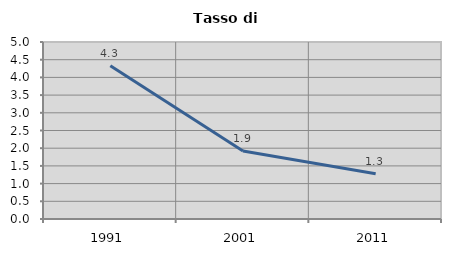
| Category | Tasso di disoccupazione   |
|---|---|
| 1991.0 | 4.327 |
| 2001.0 | 1.923 |
| 2011.0 | 1.276 |